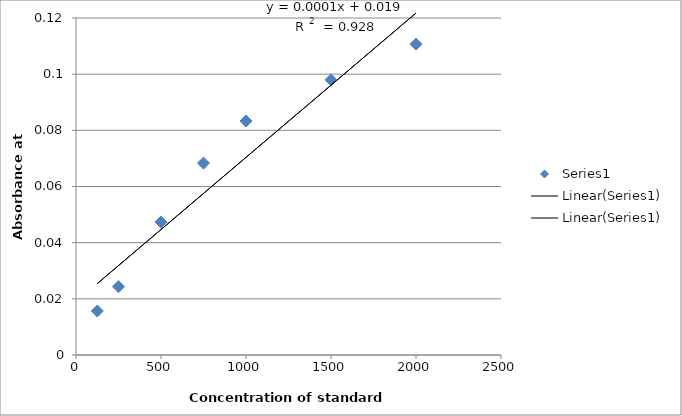
| Category | Series 0 |
|---|---|
| 2000.0 | 0.111 |
| 1500.0 | 0.098 |
| 1000.0 | 0.083 |
| 750.0 | 0.068 |
| 500.0 | 0.047 |
| 250.0 | 0.024 |
| 125.0 | 0.016 |